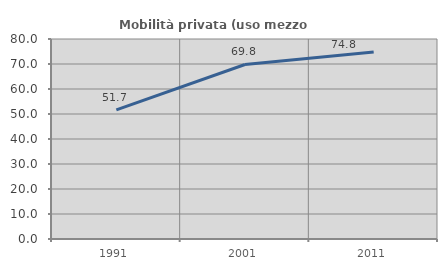
| Category | Mobilità privata (uso mezzo privato) |
|---|---|
| 1991.0 | 51.676 |
| 2001.0 | 69.807 |
| 2011.0 | 74.844 |